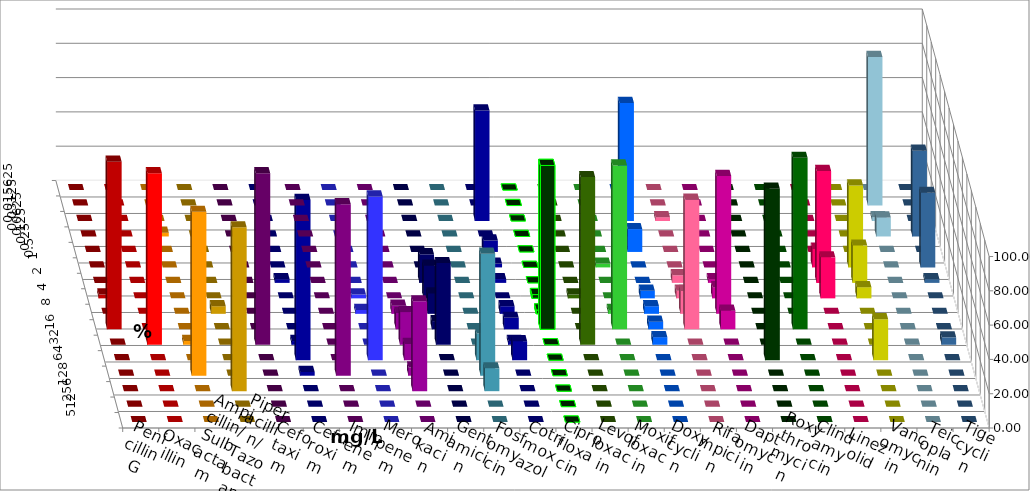
| Category | Penicillin G | Oxacillin | Ampicillin/ Sulbactam | Piperacillin/ Tazobactam | Cefotaxim | Cefuroxim | Imipenem | Meropenem | Amikacin | Gentamicin | Fosfomycin | Cotrimoxazol | Ciprofloxacin | Levofloxacin | Moxifloxacin | Doxycyclin | Rifampicin | Daptomycin | Roxythromycin | Clindamycin | Linezolid | Vancomycin | Teicoplanin | Tigecyclin |
|---|---|---|---|---|---|---|---|---|---|---|---|---|---|---|---|---|---|---|---|---|---|---|---|---|
| 0.015625 | 0 | 0 | 0 | 0 | 0 | 0 | 0 | 0 | 0 | 0 | 0 | 0 | 0 | 0 | 0 | 0 | 0 | 0 | 0 | 0 | 0 | 0 | 0 | 0 |
| 0.03125 | 0 | 0 | 0 | 0 | 0 | 0 | 0 | 0 | 0 | 0 | 0 | 0 | 0 | 0 | 0 | 0 | 0 | 0 | 0 | 0 | 0 | 0 | 0 | 86.667 |
| 0.0625 | 0 | 0 | 0 | 0 | 0 | 0 | 0 | 0 | 0 | 0 | 0 | 64.444 | 0 | 0 | 0 | 68.889 | 2.222 | 0 | 0 | 0 | 0 | 0 | 0 | 2.222 |
| 0.125 | 0 | 0 | 2.222 | 0 | 0 | 0 | 0 | 0 | 0 | 0 | 0 | 0 | 0 | 0 | 0 | 0 | 0 | 0 | 0 | 0 | 0 | 0 | 50 | 11.111 |
| 0.25 | 0 | 0 | 0 | 0 | 0 | 0 | 0 | 0 | 0 | 0 | 0 | 6.667 | 0 | 0 | 0 | 13.333 | 0 | 0 | 0 | 0 | 0 | 0 | 0 | 0 |
| 0.5 | 0 | 0 | 0 | 0 | 0 | 0 | 0 | 0 | 0 | 0 | 0 | 2.222 | 0 | 0 | 2.222 | 0 | 0 | 0 | 0 | 0 | 10.87 | 47.826 | 43.478 | 0 |
| 1.0 | 0 | 0 | 0 | 0 | 0 | 0 | 2.174 | 0 | 0 | 16.667 | 0 | 2.222 | 0 | 0 | 0 | 0 | 4.444 | 2.174 | 0 | 0 | 65.217 | 21.739 | 2.174 | 0 |
| 2.0 | 2.222 | 0 | 0 | 0 | 0 | 0 | 0 | 2.222 | 0 | 19.048 | 0 | 0 | 2.222 | 2.222 | 0 | 4.444 | 4.444 | 6.522 | 0 | 0 | 23.913 | 6.522 | 0 | 0 |
| 4.0 | 0 | 0 | 0 | 4.444 | 0 | 0 | 0 | 2.222 | 4.762 | 11.905 | 0 | 4.444 | 2.222 | 0 | 2.222 | 4.444 | 13.333 | 80.435 | 0 | 0 | 0 | 0 | 0 | 0 |
| 8.0 | 97.778 | 0 | 0 | 0 | 0 | 0 | 0 | 0 | 9.524 | 4.762 | 0 | 6.667 | 95.556 | 0 | 95.556 | 4.444 | 75.556 | 10.87 | 0 | 100 | 0 | 0 | 0 | 0 |
| 16.0 | 0 | 100 | 2.222 | 0 | 100 | 0 | 2.174 | 0 | 19.048 | 47.619 | 0 | 2.222 | 0 | 97.778 | 0 | 4.444 | 0 | 0 | 0 | 0 | 0 | 0 | 4.348 | 0 |
| 32.0 | 0 | 0 | 0 | 0 | 0 | 0 | 93.478 | 95.556 | 9.524 | 0 | 15.556 | 11.111 | 0 | 0 | 0 | 0 | 0 | 0 | 100 | 0 | 0 | 23.913 | 0 | 0 |
| 64.0 | 0 | 0 | 95.556 | 0 | 0 | 100 | 2.174 | 0 | 4.762 | 0 | 71.111 | 0 | 0 | 0 | 0 | 0 | 0 | 0 | 0 | 0 | 0 | 0 | 0 | 0 |
| 128.0 | 0 | 0 | 0 | 95.556 | 0 | 0 | 0 | 0 | 52.381 | 0 | 13.333 | 0 | 0 | 0 | 0 | 0 | 0 | 0 | 0 | 0 | 0 | 0 | 0 | 0 |
| 256.0 | 0 | 0 | 0 | 0 | 0 | 0 | 0 | 0 | 0 | 0 | 0 | 0 | 0 | 0 | 0 | 0 | 0 | 0 | 0 | 0 | 0 | 0 | 0 | 0 |
| 512.0 | 0 | 0 | 0 | 0 | 0 | 0 | 0 | 0 | 0 | 0 | 0 | 0 | 0 | 0 | 0 | 0 | 0 | 0 | 0 | 0 | 0 | 0 | 0 | 0 |